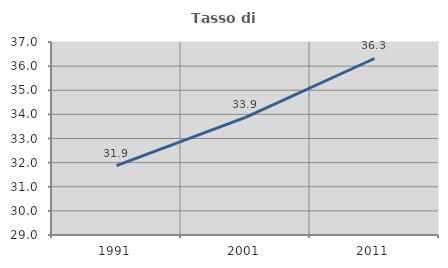
| Category | Tasso di occupazione   |
|---|---|
| 1991.0 | 31.873 |
| 2001.0 | 33.874 |
| 2011.0 | 36.316 |